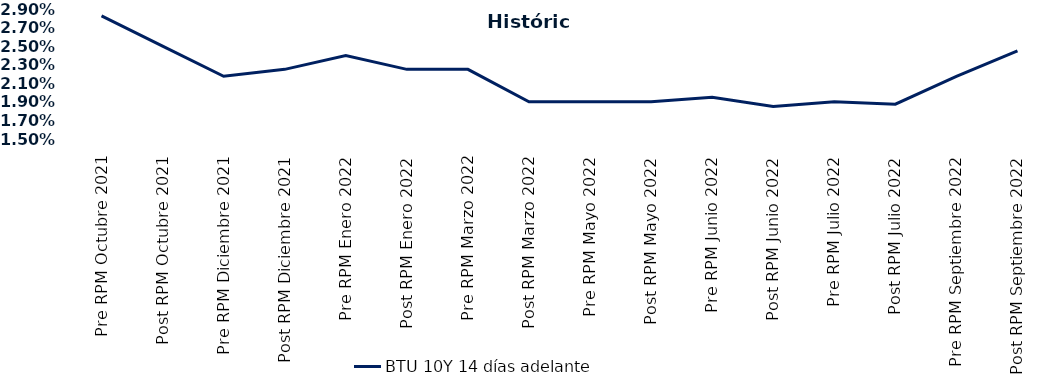
| Category | BTU 10Y 14 días adelante |
|---|---|
| Pre RPM Octubre 2021 | 0.028 |
| Post RPM Octubre 2021 | 0.025 |
| Pre RPM Diciembre 2021 | 0.022 |
| Post RPM Diciembre 2021 | 0.022 |
| Pre RPM Enero 2022 | 0.024 |
| Post RPM Enero 2022 | 0.022 |
| Pre RPM Marzo 2022 | 0.022 |
| Post RPM Marzo 2022 | 0.019 |
| Pre RPM Mayo 2022 | 0.019 |
| Post RPM Mayo 2022 | 0.019 |
| Pre RPM Junio 2022 | 0.02 |
| Post RPM Junio 2022 | 0.018 |
| Pre RPM Julio 2022 | 0.019 |
| Post RPM Julio 2022 | 0.019 |
| Pre RPM Septiembre 2022 | 0.022 |
| Post RPM Septiembre 2022 | 0.024 |